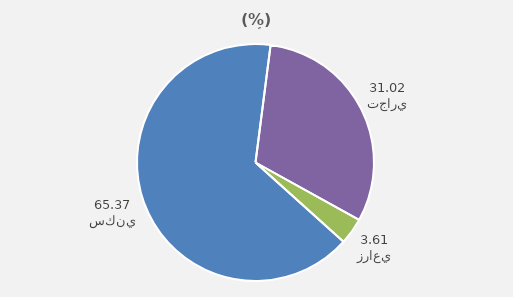
| Category | Series 0 |
|---|---|
| سكني | 65.37 |
| تجاري | 31.02 |
| زراعي | 3.61 |